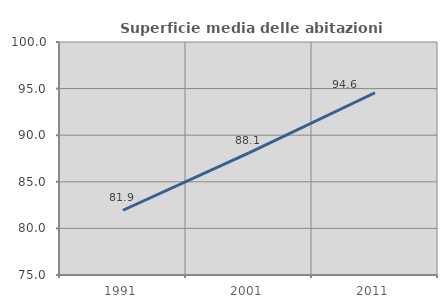
| Category | Superficie media delle abitazioni occupate |
|---|---|
| 1991.0 | 81.948 |
| 2001.0 | 88.114 |
| 2011.0 | 94.556 |